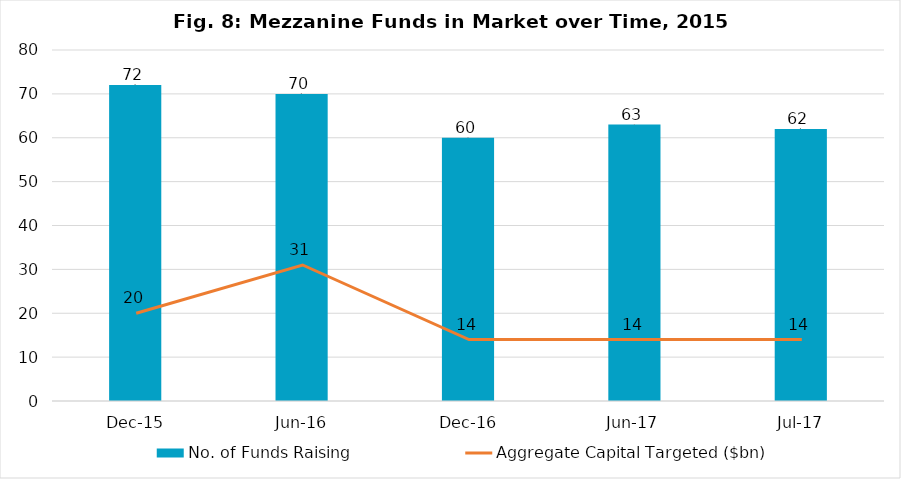
| Category | No. of Funds Raising |
|---|---|
|  Dec-15 | 72 |
|  Jun-16 | 70 |
|  Dec-16 | 60 |
| Jun-17 | 63 |
|  Jul-17 | 62 |